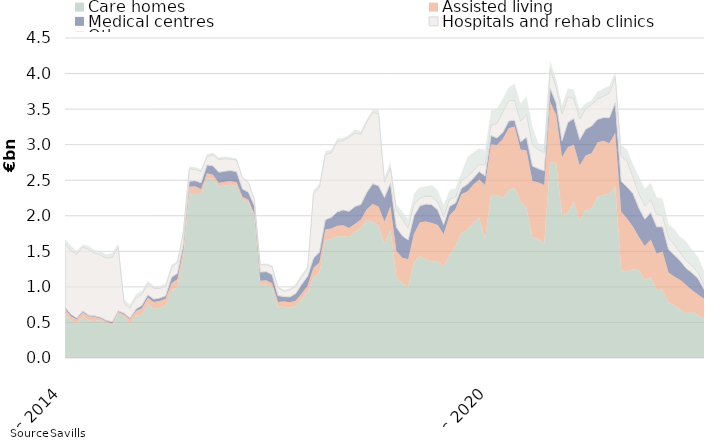
| Category | Care homes | Assisted living | Medical centres | Hospitals and rehab clinics | Other |
|---|---|---|---|---|---|
| 2014-12-01 | 633736081 | 57759854 | 25749999 | 891599738 | 64340644 |
| 2015-01-01 | 530736081 | 57759854 | 25749999 | 891599738 | 71465644 |
| 2015-02-01 | 483168082 | 57759854 | 20749999 | 896099737 | 47465644 |
| 2015-03-01 | 584248082 | 57759854 | 20749999 | 897080987 | 35574599 |
| 2015-04-01 | 529356082 | 57759854 | 15749999 | 924420986 | 46426599 |
| 2015-05-01 | 520608080 | 57759854 | 15749999 | 878720989 | 46426599 |
| 2015-06-01 | 533256112 | 23084854 | 15749999 | 876900990 | 49446599 |
| 2015-07-01 | 490421115 | 23084854 | 15749999 | 875398489 | 52902199 |
| 2015-08-01 | 463331115 | 23084854 | 22535999 | 907658735 | 59202199 |
| 2015-09-01 | 621256115 | 25684854 | 16839999 | 894158738 | 54702200 |
| 2015-10-01 | 587326115 | 25684854 | 16839999 | 139658736 | 52047000 |
| 2015-11-01 | 471877887 | 72825922 | 16839999 | 139508737 | 52047000 |
| 2015-12-01 | 593556246 | 68890922 | 27614999 | 157908739 | 52496999 |
| 2016-01-01 | 606656246 | 93190922 | 41614999 | 153408740 | 50721998 |
| 2016-02-01 | 754539246 | 93190922 | 41614999 | 153858740 | 39721998 |
| 2016-03-01 | 687824246 | 98850422 | 41614999 | 149377489 | 39721998 |
| 2016-04-01 | 701548246 | 98850422 | 41614999 | 136827489 | 28869998 |
| 2016-05-01 | 734016248 | 98850422 | 41614999 | 136827489 | 37869998 |
| 2016-06-01 | 941523216 | 109570422 | 83842999 | 134147490 | 39449998 |
| 2016-07-01 | 997563216 | 109570422 | 83842999 | 153319989 | 28209997 |
| 2016-08-01 | 1418063215 | 109570422 | 80368999 | 163139991 | 26909995 |
| 2016-09-01 | 2301038216 | 106970422 | 78890000 | 174533091 | 31909995 |
| 2016-10-01 | 2307038216 | 106970422 | 78890000 | 160033093 | 30909995 |
| 2016-11-01 | 2302654904 | 70446953 | 92390000 | 156208094 | 32409994 |
| 2016-12-01 | 2523976544 | 74801952 | 115752000 | 118658093 | 33459994 |
| 2017-01-01 | 2522326543 | 55001951 | 125059800 | 158158090 | 28109995 |
| 2017-02-01 | 2407511543 | 55001951 | 149359800 | 178733089 | 28109995 |
| 2017-03-01 | 2428283206 | 49342451 | 149359800 | 177233090 | 28109995 |
| 2017-04-01 | 2436659206 | 49792450 | 149359800 | 159983091 | 28109995 |
| 2017-05-01 | 2416709206 | 54792450 | 149359800 | 164483090 | 19109995 |
| 2017-06-01 | 2230904206 | 38072450 | 107131800 | 154483091 | 16259995 |
| 2017-07-01 | 2187064205 | 38072450 | 107131800 | 133313092 | 14749996 |
| 2017-08-01 | 1991964206 | 38072450 | 111838800 | 93893091 | 9749998 |
| 2017-09-01 | 1026949205 | 59156450 | 121613798 | 101239339 | 11749996 |
| 2017-10-01 | 1032949205 | 59156450 | 122794094 | 101239339 | 11749996 |
| 2017-11-01 | 998051659 | 51823997 | 121994094 | 110189339 | 19607117 |
| 2017-12-01 | 722228264.65 | 64485392.34 | 91375634 | 109439340 | 20394618 |
| 2018-01-01 | 720793264.65 | 73735393.34 | 68067834 | 74639342 | 22894617 |
| 2018-02-01 | 707431263.65 | 75083233.34 | 76967834 | 100209344 | 22894617 |
| 2018-03-01 | 730939600.65 | 75083233.34 | 101967834 | 100209344 | 37894617 |
| 2018-04-01 | 827919601.65 | 74633234.34 | 134166234 | 102309343 | 37894617 |
| 2018-05-01 | 920342101.65 | 94273234.34 | 134166234 | 97809344 | 43894617 |
| 2018-06-01 | 1132462101.65 | 138273234.34 | 134166234 | 912809344 | 42144617 |
| 2018-07-01 | 1200092100.65 | 143673234.34 | 145666234 | 910309345 | 51944617 |
| 2018-08-01 | 1648382098.65 | 157723234.34 | 137647234 | 919564346 | 51944617 |
| 2018-09-01 | 1672277099.66 | 147639234.34 | 158043236 | 907324998 | 44944619 |
| 2018-10-01 | 1707357099.66 | 151089234.34 | 195391740 | 988324994 | 44944619 |
| 2018-11-01 | 1711797099.66 | 155979234.34 | 214712300 | 974149994 | 37837498 |
| 2018-12-01 | 1700270494.01 | 128897840 | 232943760 | 1040049993 | 35549998 |
| 2019-01-01 | 1767835495.01 | 115597839 | 246203760 | 1035349994 | 46839999 |
| 2019-02-01 | 1832357496.01 | 114249999 | 213003760 | 985490494 | 46839999 |
| 2019-03-01 | 1936404184.01 | 156848310 | 233003760 | 994090494 | 33089999 |
| 2019-04-01 | 1913276683.01 | 251948310 | 285155359 | 1002880494 | 33089999 |
| 2019-05-01 | 1855350183.01 | 271883310 | 295091359 | 1009130493 | 65889999 |
| 2019-06-01 | 1600530183.01 | 317883310 | 338910558 | 213630492 | 71139999 |
| 2019-07-01 | 1802250185.01 | 326550262 | 332410558 | 213630492 | 83739997 |
| 2019-08-01 | 1144590186.01 | 363547512 | 332410558 | 240875492 | 83739997 |
| 2019-09-01 | 1046975186 | 363547512 | 308580808 | 235521492 | 105439996 |
| 2019-10-01 | 999895186 | 389797512 | 270052008 | 166221496 | 128973996 |
| 2019-11-01 | 1348676185 | 403512512 | 250531448 | 166518696 | 147173996 |
| 2019-12-01 | 1436021186 | 471912512 | 231531448 | 110118696 | 150234746 |
| 2020-01-01 | 1386087141 | 533140013 | 245211448 | 110118696 | 137444745 |
| 2020-02-01 | 1358892933.36 | 541184833 | 256248136 | 114033196 | 162444745 |
| 2020-03-01 | 1359571245.36 | 509586522 | 211248136 | 109933195 | 164594745 |
| 2020-04-01 | 1285138745.36 | 455118522 | 136898136 | 108543196 | 164594745 |
| 2020-05-01 | 1447483164.36 | 559543521.96 | 126962136 | 102293197 | 125794745 |
| 2020-06-01 | 1572243164.36 | 518143521.96 | 89556937 | 82793198 | 124044744 |
| 2020-07-01 | 1757903270.73 | 545381569.96 | 84556937 | 113523198 | 101644746 |
| 2020-08-01 | 1803513271.73 | 538816589.45 | 102061337 | 103523197 | 274144745 |
| 2020-09-01 | 1888440256.54 | 547632192.28 | 90395087 | 109677196 | 252444746 |
| 2020-10-01 | 1978180292 | 533682192.28 | 111995087 | 97977196 | 228910746 |
| 2020-11-01 | 1665039293 | 767307192.28 | 130112487 | 152879995 | 208460747 |
| 2020-12-01 | 2294464292.86 | 710807192.28 | 124112487 | 143379996 | 207709997 |
| 2021-01-01 | 2291797829.77 | 704629692.28 | 97172487 | 205879995 | 206709998 |
| 2021-02-01 | 2251486125.17 | 827692871.28 | 93575799 | 290996995 | 185699998 |
| 2021-03-01 | 2364136125.17 | 868373933.64 | 100275799 | 286496996 | 184924998 |
| 2021-04-01 | 2389616124.17 | 864137936.64 | 90275800 | 276996996 | 240479998 |
| 2021-05-01 | 2208345705.17 | 724537936.68 | 108436800 | 287996996 | 249129998 |
| 2021-06-01 | 2107366705.17 | 811337936.68 | 186636799 | 321096995 | 254172497 |
| 2021-07-01 | 1698576598.8 | 791700536.68 | 209216799 | 296675495 | 254172497 |
| 2021-08-01 | 1673497598.8 | 794202523.19 | 195212399 | 265675496 | 88536498 |
| 2021-09-01 | 1610965613.99 | 821139920.36 | 200342399 | 258375497 | 111736497 |
| 2021-10-01 | 2750841584.78 | 850609920.36 | 194742399 | 269475497 | 115336497 |
| 2021-11-01 | 2745941584.78 | 678169920.36 | 164124999 | 219275497 | 115336497 |
| 2021-12-01 | 2006821584.92 | 816019920.36 | 231765799 | 375807997 | 119026497 |
| 2022-01-01 | 2042127093.01 | 924632354.36 | 347795798 | 356307998 | 123538497 |
| 2022-02-01 | 2196388858.57 | 800724355.36 | 371855797 | 283040998 | 120548496 |
| 2022-03-01 | 1928563857.57 | 777968293 | 365155797 | 288040998 | 128123495 |
| 2022-04-01 | 2088421001.57 | 757572290 | 371030797 | 291220998 | 72568495 |
| 2022-05-01 | 2102802501.57 | 775809790 | 383877297 | 298220998 | 63918495 |
| 2022-06-01 | 2264316501.57 | 765554139 | 324546350.59 | 289845999 | 100975996 |
| 2022-07-01 | 2295335054.57 | 759514744 | 326355100.59 | 298537499 | 108652496 |
| 2022-08-01 | 2308126327.57 | 712530488 | 358855100.59 | 346837499 | 101788496 |
| 2022-09-01 | 2408147158.07 | 756984931.47 | 423725100.57 | 359337499 | 78588497 |
| 2022-10-01 | 1238706151.82 | 817226096.45 | 428725100.57 | 348237499 | 162293497 |
| 2022-11-01 | 1215191111.82 | 747793596.45 | 442525100.57 | 363237500 | 162293497 |
| 2022-12-01 | 1243513245.82 | 600943596.45 | 468784300.57 | 224805000 | 181293497 |
| 2023-01-01 | 1239216245.82 | 460771162.45 | 407129301.57 | 201304998 | 240031497 |
| 2023-02-01 | 1091671192.5 | 482671162.45 | 378228502.57 | 184304998 | 239031498 |
| 2023-03-01 | 1142914580.5 | 524346162.45 | 378228502.57 | 179304998 | 238331499 |
| 2023-04-01 | 954057437.5 | 513346162.45 | 377353502.57 | 176124998 | 238331499 |
| 2023-05-01 | 961955937.5 | 535708662.45 | 346346002.57 | 158124998 | 238331499 |
| 2023-06-01 | 778960936.5 | 424564313.45 | 325412949.98 | 156649998 | 197731499 |
| 2023-07-01 | 738773068.5 | 408936108.45 | 301024199.98 | 144149997 | 218078999 |
| 2023-08-01 | 689420795.5 | 408936108.45 | 265024199.98 | 115349996 | 221078999 |
| 2023-09-01 | 619604965 | 407728664.98 | 233774200 | 102849996 | 274878998 |
| 2023-10-01 | 652064965 | 302267500 | 241024200 | 102849996 | 218323998 |
| 2023-11-01 | 606200005 | 285540000 | 227224200 | 82849996 | 218323998 |
| 2023-12-01 | 549185871 | 282640000 | 133324200 | 64749996 | 193323998 |